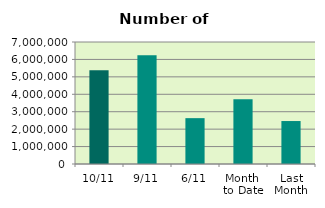
| Category | Series 0 |
|---|---|
| 10/11 | 5381370 |
| 9/11 | 6233128 |
| 6/11 | 2630694 |
| Month 
to Date | 3713750.857 |
| Last
Month | 2465363.545 |